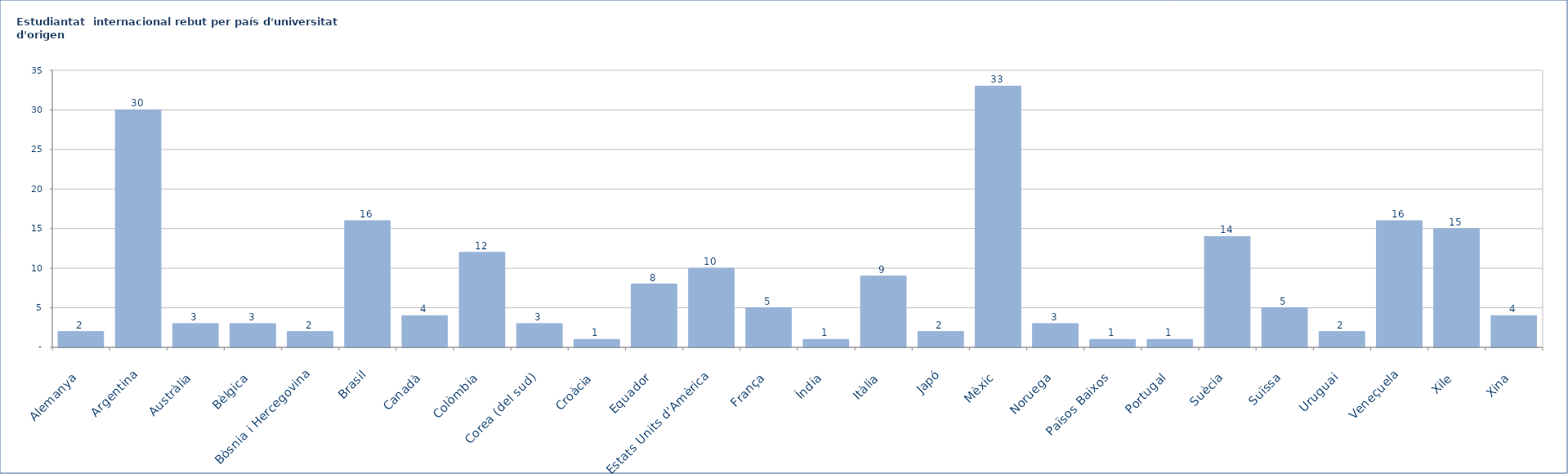
| Category | Series 0 |
|---|---|
| Alemanya | 2 |
| Argentina | 30 |
| Austràlia  | 3 |
| Bèlgica | 3 |
| Bòsnia i Hercegovina | 2 |
| Brasil | 16 |
| Canadà | 4 |
| Colòmbia | 12 |
| Corea (del sud) | 3 |
| Croàcia | 1 |
| Equador | 8 |
| Estats Units d'Amèrica | 10 |
| França | 5 |
| Índia | 1 |
| Itàlia | 9 |
| Japó | 2 |
| Mèxic | 33 |
| Noruega | 3 |
| Països Baixos | 1 |
| Portugal | 1 |
| Suècia | 14 |
| Suïssa | 5 |
| Uruguai | 2 |
| Veneçuela | 16 |
| Xile | 15 |
| Xina | 4 |